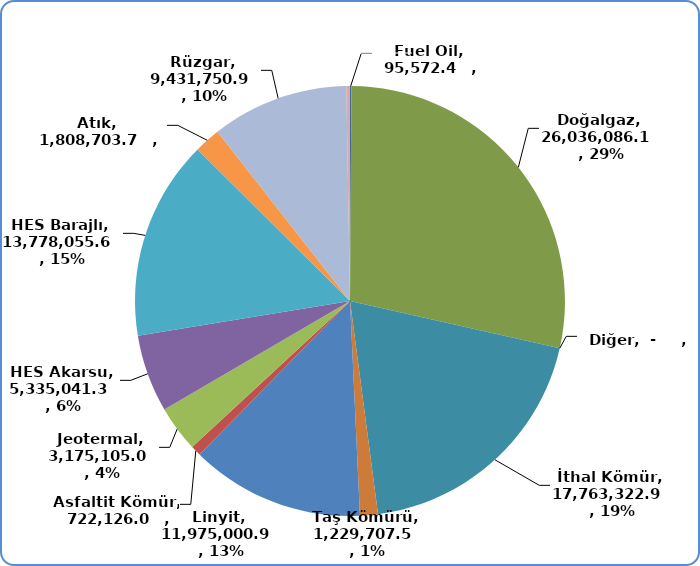
| Category | Series 0 |
|---|---|
| Fuel Oil | 95572.42 |
| Motorin | 0 |
| Doğalgaz | 26036086.1 |
| Diğer | 0 |
| İthal Kömür | 17763322.87 |
| Taş Kömürü | 1229707.47 |
| Linyit | 11975000.93 |
| Asfaltit Kömür | 722126.02 |
| Jeotermal | 3175105.02 |
| HES Akarsu | 5335041.34 |
| HES Barajlı | 13778055.55 |
| Atık | 1808703.74 |
| Rüzgar | 9431750.88 |
| Güneş | 250474.44 |